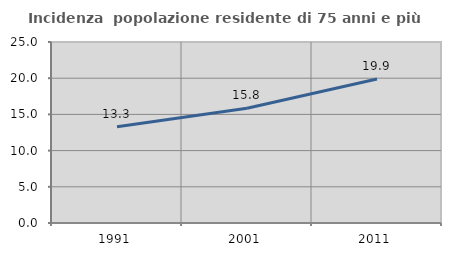
| Category | Incidenza  popolazione residente di 75 anni e più |
|---|---|
| 1991.0 | 13.306 |
| 2001.0 | 15.839 |
| 2011.0 | 19.898 |